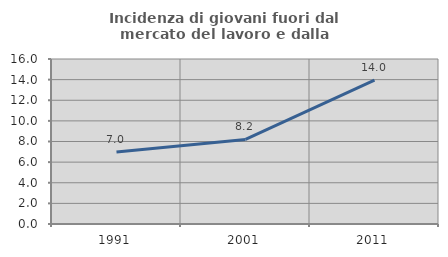
| Category | Incidenza di giovani fuori dal mercato del lavoro e dalla formazione  |
|---|---|
| 1991.0 | 6.993 |
| 2001.0 | 8.203 |
| 2011.0 | 13.953 |